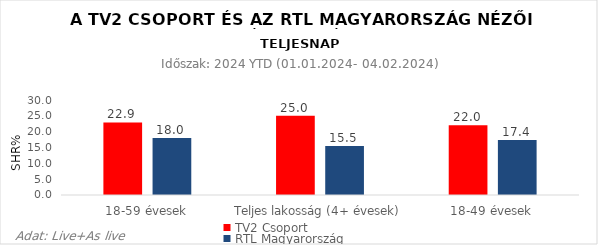
| Category | TV2 Csoport | RTL Magyarország |
|---|---|---|
| 18-59 évesek | 22.9 | 18 |
| Teljes lakosság (4+ évesek) | 25 | 15.5 |
| 18-49 évesek | 22 | 17.4 |